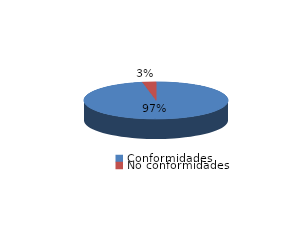
| Category | Series 0 |
|---|---|
| Conformidades | 415 |
| No conformidades | 13 |